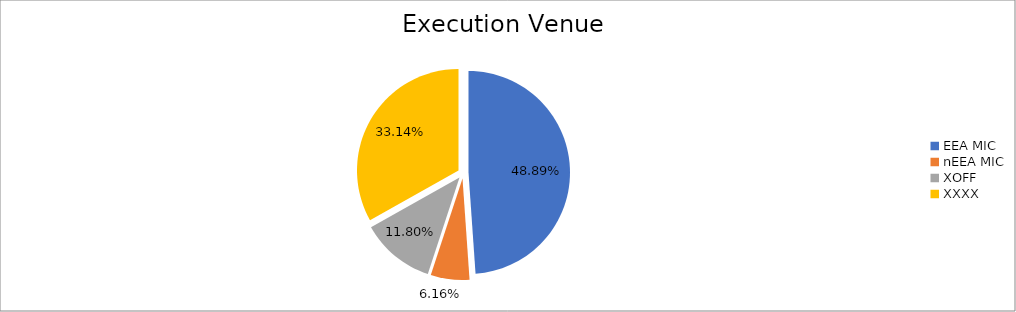
| Category | Series 0 |
|---|---|
| EEA MIC | 6483948.441 |
| nEEA MIC | 817064.382 |
| XOFF | 1565456.099 |
| XXXX | 4394995.947 |